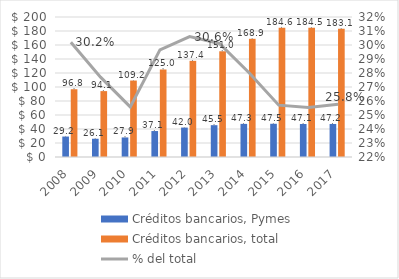
| Category | Créditos bancarios, Pymes | Créditos bancarios, total |
|---|---|---|
| 2008.0 | 29.227 | 96.812 |
| 2009.0 | 26.077 | 94.124 |
| 2010.0 | 27.934 | 109.205 |
| 2011.0 | 37.076 | 125.022 |
| 2012.0 | 42.043 | 137.367 |
| 2013.0 | 45.477 | 151.034 |
| 2014.0 | 47.304 | 168.859 |
| 2015.0 | 47.454 | 184.621 |
| 2016.0 | 47.113 | 184.536 |
| 2017.0 | 47.195 | 183.149 |